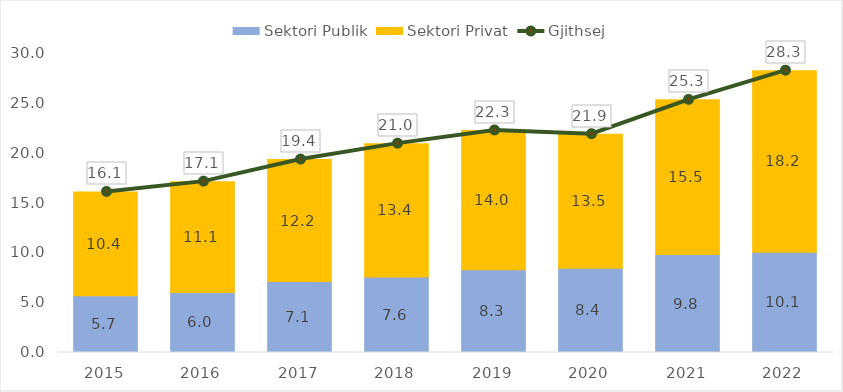
| Category | Sektori Publik | Sektori Privat |
|---|---|---|
| 2015.0 | 5.695 | 10.417 |
| 2016.0 | 6.032 | 11.112 |
| 2017.0 | 7.115 | 12.246 |
| 2018.0 | 7.569 | 13.387 |
| 2019.0 | 8.314 | 13.965 |
| 2020.0 | 8.442 | 13.462 |
| 2021.0 | 9.82 | 15.527 |
| 2022.0 | 10.055 | 18.223 |